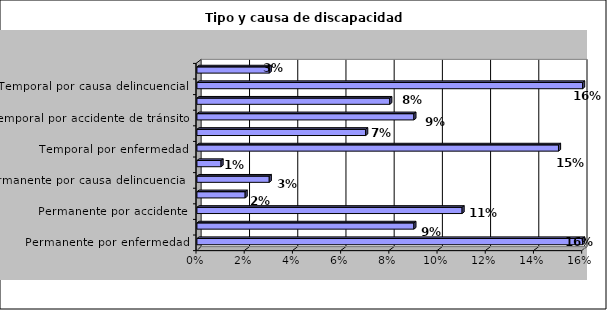
| Category | Series 0 |
|---|---|
| Permanente por enfermedad | 0.16 |
| Congenita - de nacimiento | 0.09 |
| Permanente por accidente | 0.11 |
| Permanente por lesión deportiva | 0.02 |
| Permanente por causa delincuencial | 0.03 |
| Permanente por causa de guerra | 0.01 |
| Temporal por enfermedad | 0.15 |
| Temporal por accidente laboral | 0.07 |
| Temporal por accidente de tránsito | 0.09 |
| Temporal por lesión deportiva | 0.08 |
| Temporal por causa delincuencial | 0.16 |
| Otro | 0.03 |